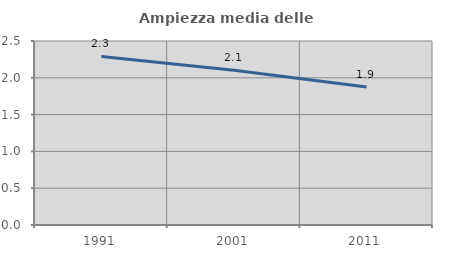
| Category | Ampiezza media delle famiglie |
|---|---|
| 1991.0 | 2.291 |
| 2001.0 | 2.103 |
| 2011.0 | 1.875 |